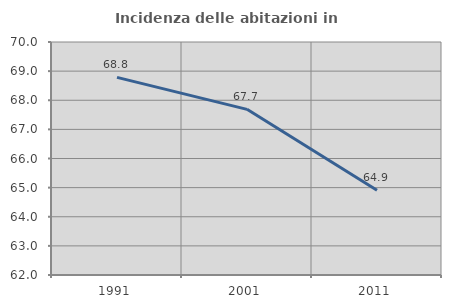
| Category | Incidenza delle abitazioni in proprietà  |
|---|---|
| 1991.0 | 68.787 |
| 2001.0 | 67.688 |
| 2011.0 | 64.909 |